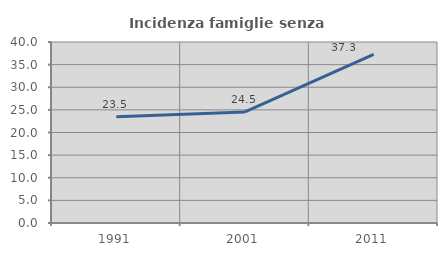
| Category | Incidenza famiglie senza nuclei |
|---|---|
| 1991.0 | 23.471 |
| 2001.0 | 24.544 |
| 2011.0 | 37.291 |